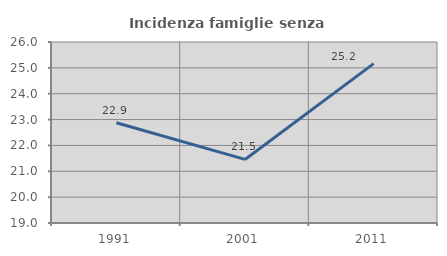
| Category | Incidenza famiglie senza nuclei |
|---|---|
| 1991.0 | 22.877 |
| 2001.0 | 21.459 |
| 2011.0 | 25.165 |